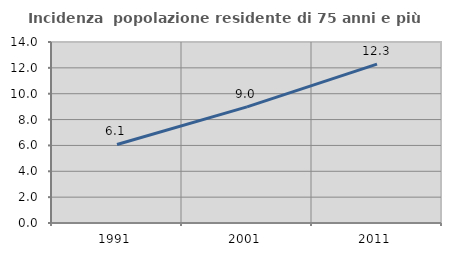
| Category | Incidenza  popolazione residente di 75 anni e più |
|---|---|
| 1991.0 | 6.073 |
| 2001.0 | 8.986 |
| 2011.0 | 12.293 |